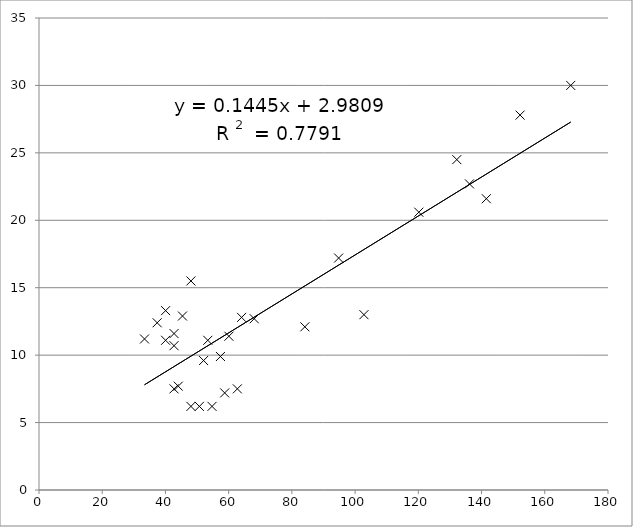
| Category | Chl-a probe** |
|---|---|
| 48.059999999999995 | 6.2 |
| 42.72 | 7.5 |
| 40.05 | 11.1 |
| 54.73499999999999 | 6.2 |
| 52.06499999999999 | 9.6 |
| 42.72 | 10.7 |
| 168.20999999999998 | 30 |
| 152.19 | 27.8 |
| 68.085 | 12.7 |
| 48.059999999999995 | 15.5 |
| 53.4 | 11.1 |
| 37.38 | 12.4 |
| 132.165 | 24.5 |
| 64.08 | 12.8 |
| 141.51 | 21.6 |
| 60.075 | 11.4 |
| 40.05 | 13.3 |
| 84.10499999999999 | 12.1 |
| 62.745 | 7.5 |
| 136.17 | 22.7 |
| 94.78499999999998 | 17.2 |
| 57.40499999999999 | 9.9 |
| 45.39 | 12.9 |
| 50.73 | 6.2 |
| 44.055 | 7.7 |
| 42.72 | 11.6 |
| 58.73999999999999 | 7.2 |
| 33.375 | 11.2 |
| 120.15 | 20.6 |
| 102.79499999999999 | 13 |